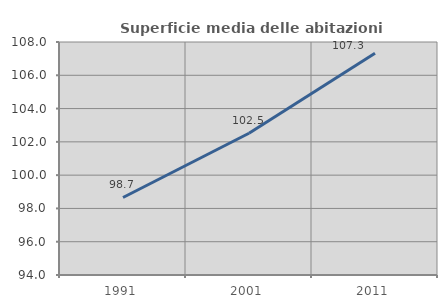
| Category | Superficie media delle abitazioni occupate |
|---|---|
| 1991.0 | 98.658 |
| 2001.0 | 102.519 |
| 2011.0 | 107.328 |